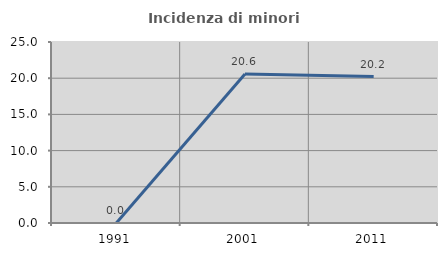
| Category | Incidenza di minori stranieri |
|---|---|
| 1991.0 | 0 |
| 2001.0 | 20.588 |
| 2011.0 | 20.221 |